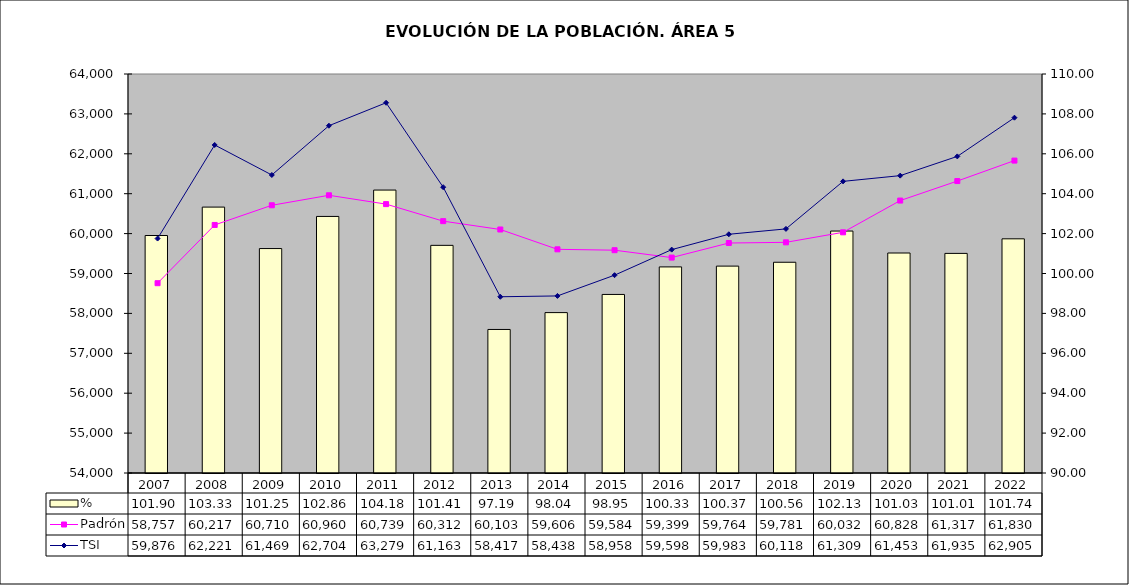
| Category | % |
|---|---|
| 2007.0 | 101.904 |
| 2008.0 | 103.328 |
| 2009.0 | 101.25 |
| 2010.0 | 102.861 |
| 2011.0 | 104.182 |
| 2012.0 | 101.411 |
| 2013.0 | 97.195 |
| 2014.0 | 98.04 |
| 2015.0 | 98.95 |
| 2016.0 | 100.33 |
| 2017.0 | 100.37 |
| 2018.0 | 100.564 |
| 2019.0 | 102.127 |
| 2020.0 | 101.027 |
| 2021.0 | 101.008 |
| 2022.0 | 101.739 |